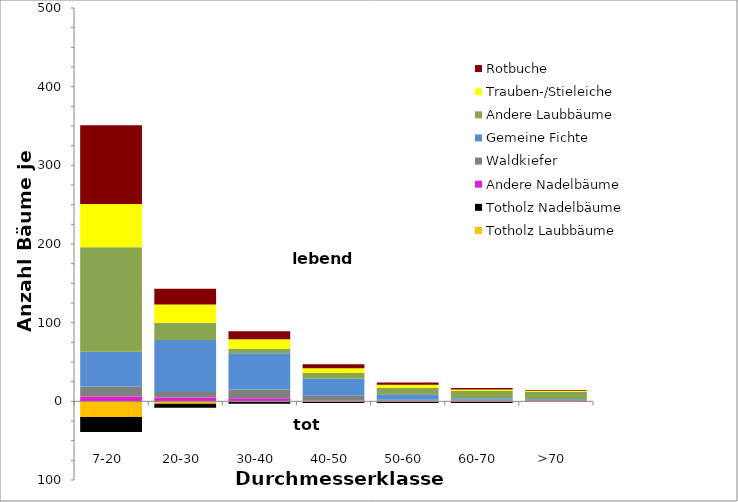
| Category | Totholz Laubbäume | Totholz Nadelbäume | Andere Nadelbäume | Waldkiefer | Gemeine Fichte | Andere Laubbäume | Trauben-/Stieleiche | Rotbuche |
|---|---|---|---|---|---|---|---|---|
| 7-20  | -20 | -19 | 6 | 13 | 44 | 133 | 55 | 100 |
| 20-30  | -3 | -5 | 5 | 7 | 66 | 22 | 23 | 20 |
| 30-40  | -1 | -2 | 4 | 11 | 46 | 6 | 12 | 10 |
| 40-50  | -1 | -1 | 1 | 6 | 22 | 7 | 6 | 5 |
| 50-60  | -1 | -1 | 1 | 1 | 7 | 8 | 4 | 3 |
| 60-70  | -1 | -1 | 1 | 1 | 2 | 9 | 2 | 2 |
| >70  | -1 | 0 | 1 | 1 | 1 | 9 | 1 | 1 |